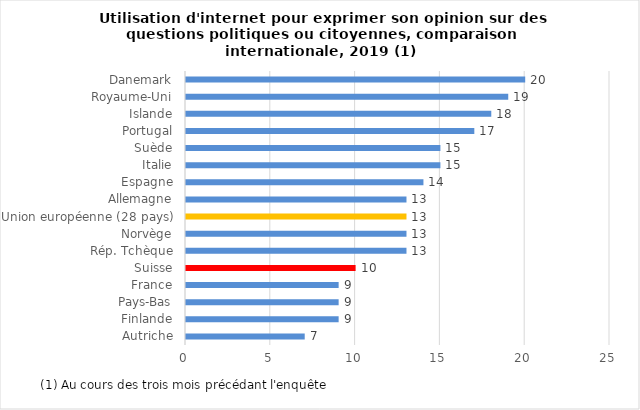
| Category | Series 0 |
|---|---|
| Autriche | 7 |
| Finlande | 9 |
| Pays-Bas | 9 |
| France | 9 |
| Suisse | 10 |
| Rép. Tchèque | 13 |
| Norvège | 13 |
| Union européenne (28 pays) | 13 |
| Allemagne | 13 |
| Espagne | 14 |
| Italie | 15 |
| Suède | 15 |
| Portugal | 17 |
| Islande | 18 |
| Royaume-Uni | 19 |
| Danemark | 20 |